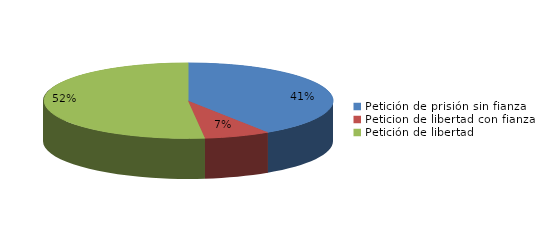
| Category | Series 0 |
|---|---|
| Petición de prisión sin fianza | 77 |
| Peticion de libertad con fianza | 14 |
| Petición de libertad | 98 |